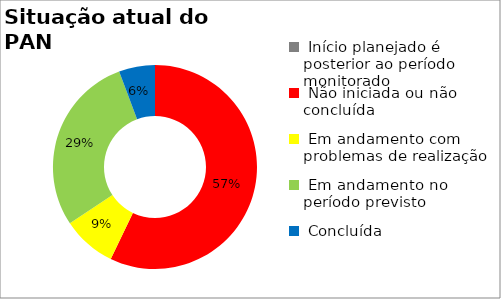
| Category | Series 0 |
|---|---|
|  Início planejado é posterior ao período monitorado | 0 |
|  Não iniciada ou não concluída | 0.571 |
|  Em andamento com problemas de realização | 0.086 |
|  Em andamento no período previsto  | 0.286 |
|  Concluída | 0.057 |